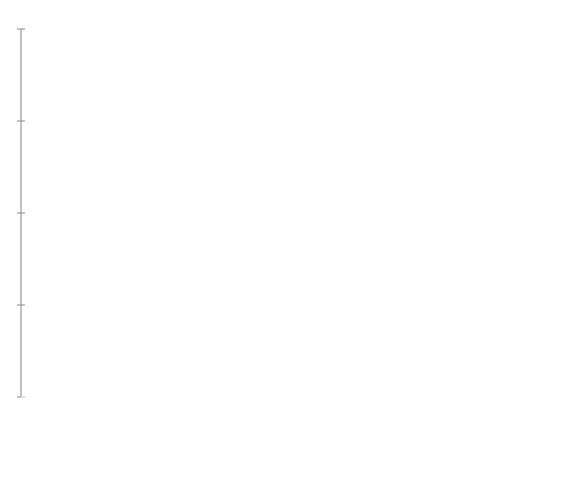
| Category | Foundation | Experienced | Leading |
|---|---|---|---|
|  | 0 | 0 | 0 |
|  | 0 | 0 | 0 |
|  | 0 | 0 | 0 |
|  | 0 | 0 | 0 |